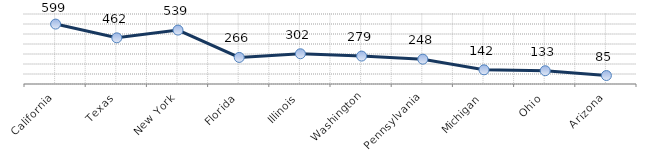
| Category | Series 0 |
|---|---|
|  California  | 599.137 |
|  Texas  | 461.774 |
|  New York  | 539.223 |
|  Florida  | 265.958 |
|  Illinois  | 302.491 |
|  Washington  | 279.11 |
|  Pennsylvania  | 248.423 |
|  Michigan  | 141.747 |
|  Ohio  | 132.979 |
|  Arizona  | 84.756 |